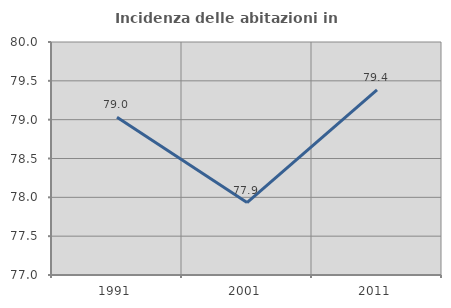
| Category | Incidenza delle abitazioni in proprietà  |
|---|---|
| 1991.0 | 79.031 |
| 2001.0 | 77.933 |
| 2011.0 | 79.384 |